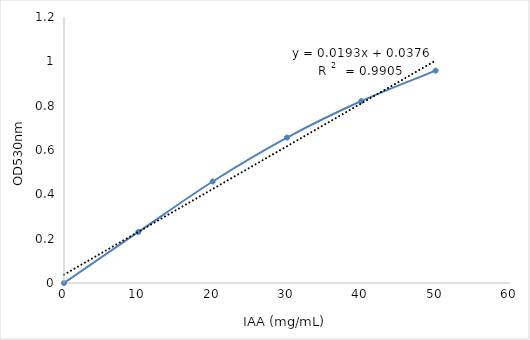
| Category | Series 0 |
|---|---|
| 0.0 | 0 |
| 10.0 | 0.23 |
| 20.0 | 0.458 |
| 30.0 | 0.656 |
| 40.0 | 0.821 |
| 50.0 | 0.958 |